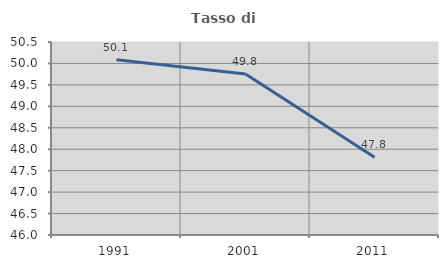
| Category | Tasso di occupazione   |
|---|---|
| 1991.0 | 50.086 |
| 2001.0 | 49.754 |
| 2011.0 | 47.811 |